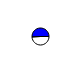
| Category | Series 0 |
|---|---|
| 0 | 11333 |
| 1 | 11724 |